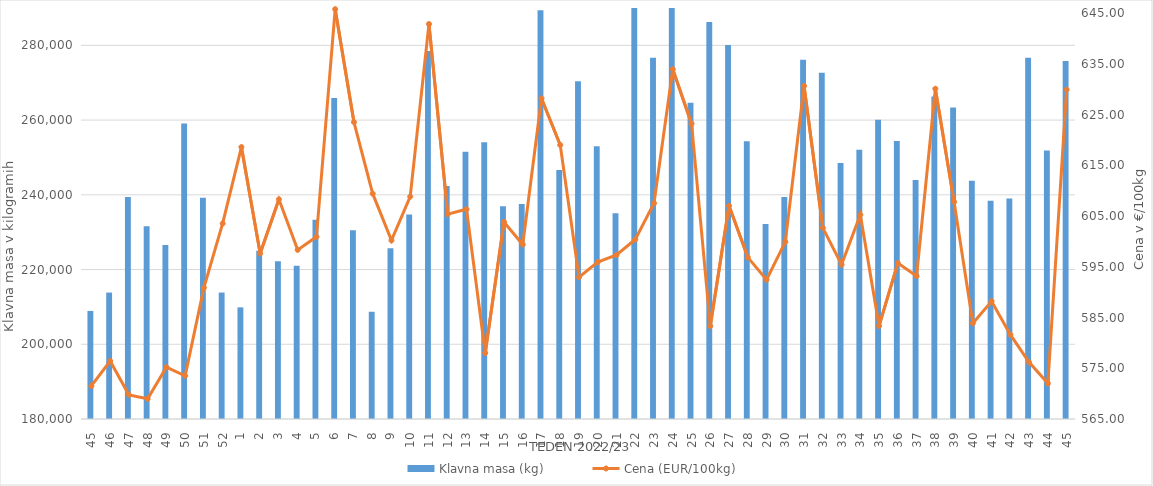
| Category | Klavna masa (kg) |
|---|---|
| 45.0 | 208920 |
| 46.0 | 213836 |
| 47.0 | 239417 |
| 48.0 | 231565 |
| 49.0 | 226575 |
| 50.0 | 259073 |
| 51.0 | 239211 |
| 52.0 | 213841 |
| 1.0 | 209877 |
| 2.0 | 225045 |
| 3.0 | 222198 |
| 4.0 | 221002 |
| 5.0 | 233306 |
| 6.0 | 265944 |
| 7.0 | 230531 |
| 8.0 | 208699 |
| 9.0 | 225712 |
| 10.0 | 234762 |
| 11.0 | 278467 |
| 12.0 | 242369 |
| 13.0 | 251507 |
| 14.0 | 254072 |
| 15.0 | 236964 |
| 16.0 | 237552 |
| 17.0 | 289400 |
| 18.0 | 246616 |
| 19.0 | 270374 |
| 20.0 | 252984 |
| 21.0 | 235060 |
| 22.0 | 290816 |
| 23.0 | 276702 |
| 24.0 | 292976 |
| 25.0 | 264669 |
| 26.0 | 286237 |
| 27.0 | 280112 |
| 28.0 | 254336 |
| 29.0 | 232178 |
| 30.0 | 239437 |
| 31.0 | 276163 |
| 32.0 | 272647 |
| 33.0 | 248536 |
| 34.0 | 252050 |
| 35.0 | 260110 |
| 36.0 | 254389 |
| 37.0 | 243933 |
| 38.0 | 266321 |
| 39.0 | 263346 |
| 40.0 | 243765 |
| 41.0 | 238404 |
| 42.0 | 239007 |
| 43.0 | 276684 |
| 44.0 | 251832 |
| 45.0 | 275816 |